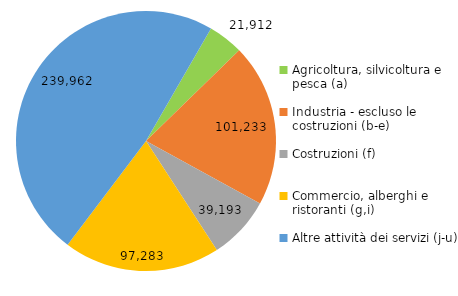
| Category | Series 0 |
|---|---|
| Agricoltura, silvicoltura e pesca (a) | 21912 |
| Industria - escluso le costruzioni (b-e) | 101233 |
| Costruzioni (f) | 39193 |
| Commercio, alberghi e ristoranti (g,i) | 97283 |
| Altre attività dei servizi (j-u) | 239962 |